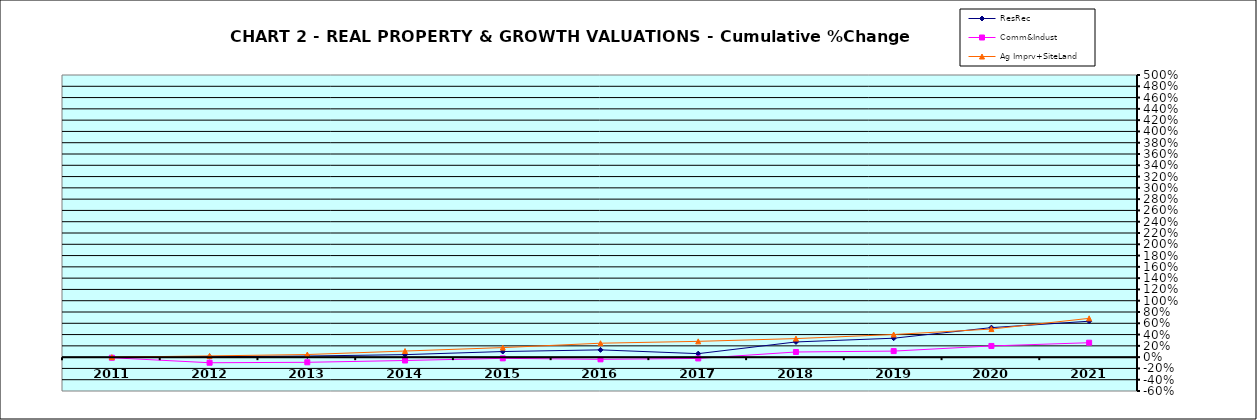
| Category | ResRec | Comm&Indust | Ag Imprv+SiteLand |
|---|---|---|---|
| 2011.0 | -0.008 | -0.01 | 0 |
| 2012.0 | 0.008 | -0.099 | 0.022 |
| 2013.0 | 0.02 | -0.091 | 0.046 |
| 2014.0 | 0.045 | -0.06 | 0.108 |
| 2015.0 | 0.099 | -0.021 | 0.169 |
| 2016.0 | 0.129 | -0.039 | 0.247 |
| 2017.0 | 0.062 | -0.023 | 0.28 |
| 2018.0 | 0.269 | 0.091 | 0.329 |
| 2019.0 | 0.336 | 0.107 | 0.401 |
| 2020.0 | 0.523 | 0.198 | 0.498 |
| 2021.0 | 0.637 | 0.256 | 0.688 |